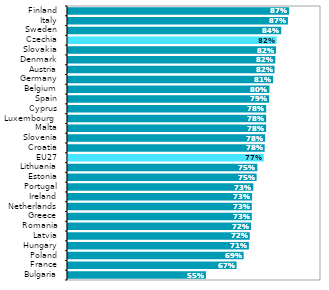
| Category | Series 1 |
|---|---|
| Bulgaria | 0.545 |
| France | 0.666 |
| Poland | 0.694 |
| Hungary | 0.715 |
| Latvia | 0.718 |
| Romania | 0.724 |
| Greece | 0.726 |
| Netherlands | 0.726 |
| Ireland | 0.727 |
| Portugal | 0.733 |
| Estonia | 0.745 |
| Lithuania | 0.748 |
| EU27 | 0.774 |
| Croatia | 0.777 |
| Slovenia | 0.779 |
| Malta | 0.783 |
| Luxembourg  | 0.783 |
| Cyprus | 0.783 |
| Spain | 0.795 |
| Belgium | 0.796 |
| Germany | 0.811 |
| Austria | 0.816 |
| Denmark | 0.819 |
| Slovakia | 0.822 |
| Czechia | 0.825 |
| Sweden | 0.843 |
| Italy | 0.869 |
| Finland | 0.874 |